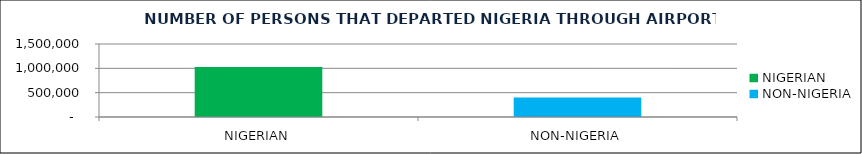
| Category | DEPARTURE |
|---|---|
| NIGERIAN | 1026383 |
| NON-NIGERIA | 399381 |